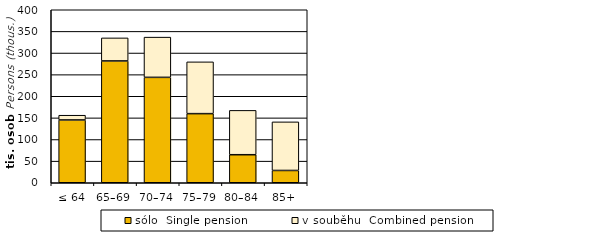
| Category | sólo  Single pension | v souběhu  Combined pension |
|---|---|---|
| ≤ 64 | 145204 | 10955 |
| 65–69 | 281680 | 53246 |
| 70–74 | 243710 | 93002 |
| 75–79 | 159799 | 119729 |
| 80–84 | 64823 | 102521 |
| 85+ | 28427 | 112328 |